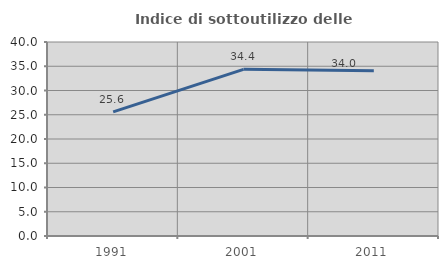
| Category | Indice di sottoutilizzo delle abitazioni  |
|---|---|
| 1991.0 | 25.606 |
| 2001.0 | 34.365 |
| 2011.0 | 34.048 |